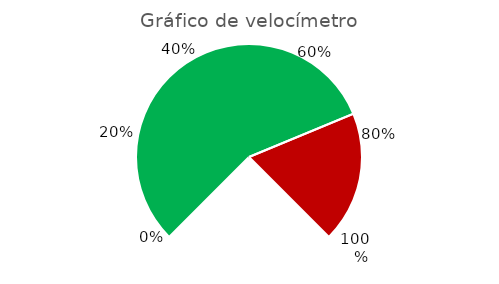
| Category | Series 0 |
|---|---|
| Valor 1 | 0.75 |
| Valor 2 | 0.25 |
| Segmento Blanco | 0.333 |